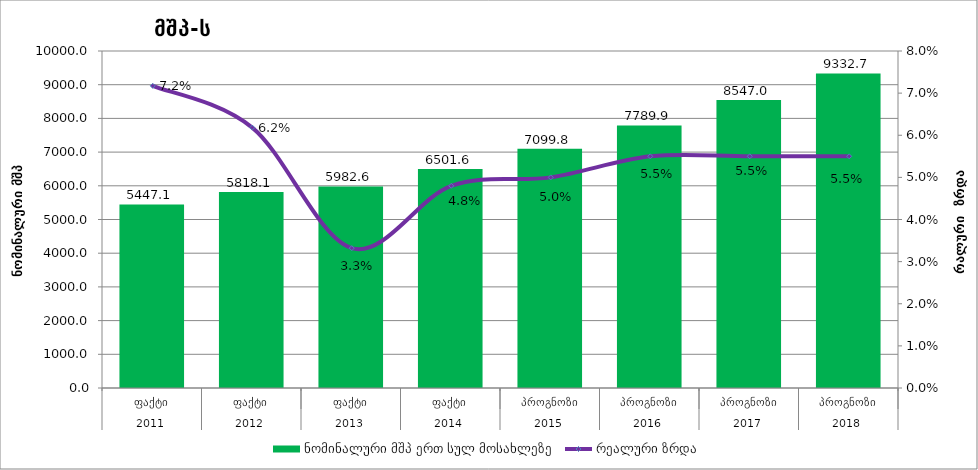
| Category | ნომინალური მშპ ერთ სულ მოსახლეზე |
|---|---|
| 0 | 5447.057 |
| 1 | 5818.055 |
| 2 | 5982.632 |
| 3 | 6501.626 |
| 4 | 7099.775 |
| 5 | 7789.872 |
| 6 | 8547.049 |
| 7 | 9332.738 |